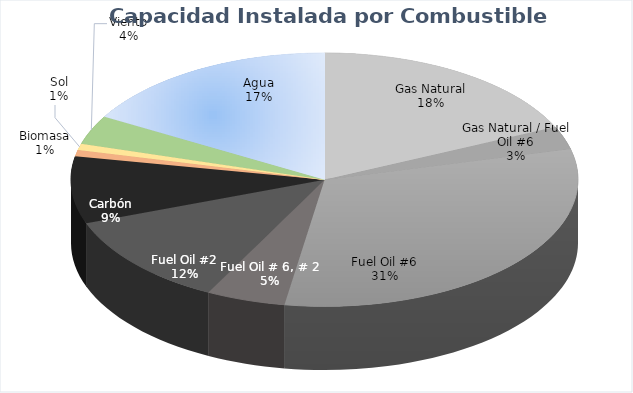
| Category | Potencia  (MW) | % |
|---|---|---|
| Gas Natural | 669 | 0.182 |
| Gas Natural / Fuel Oil #6 | 108 | 0.029 |
| Fuel Oil #6 | 1155.29 | 0.314 |
| Fuel Oil # 6, # 2 | 185 | 0.05 |
| Fuel Oil #2 | 436.4 | 0.119 |
| Carbón | 313.6 | 0.085 |
| Biomasa | 30 | 0.008 |
| Sol | 30 | 0.008 |
| Viento | 135.65 | 0.037 |
| Agua | 615.72 | 0.167 |